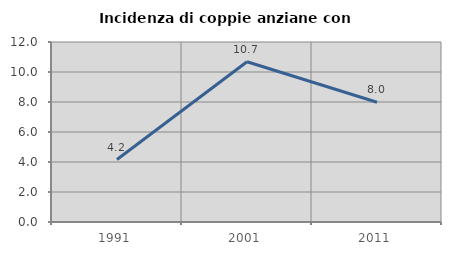
| Category | Incidenza di coppie anziane con figli |
|---|---|
| 1991.0 | 4.167 |
| 2001.0 | 10.684 |
| 2011.0 | 7.981 |